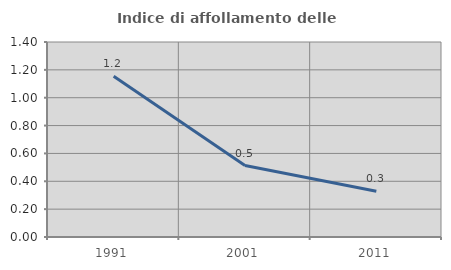
| Category | Indice di affollamento delle abitazioni  |
|---|---|
| 1991.0 | 1.153 |
| 2001.0 | 0.513 |
| 2011.0 | 0.328 |